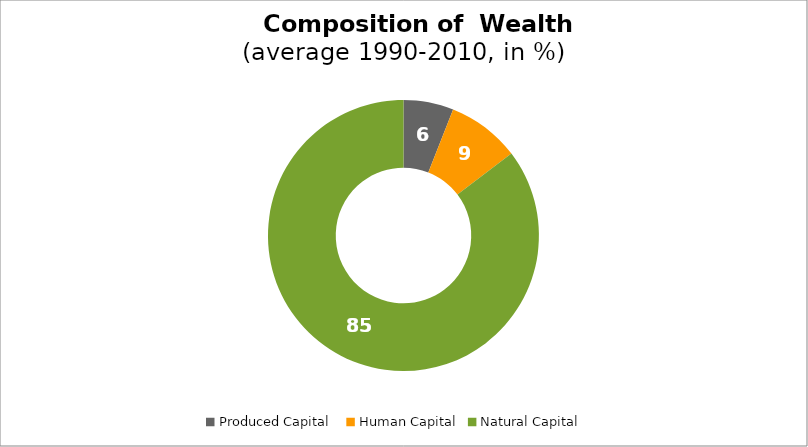
| Category | Series 0 |
|---|---|
| Produced Capital  | 5.968 |
| Human Capital | 8.694 |
| Natural Capital | 85.338 |